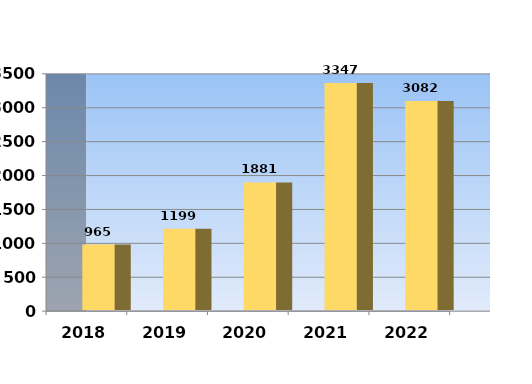
| Category | Series 0 |
|---|---|
| 2018.0 | 965 |
| 2019.0 | 1199 |
| 2020.0 | 1881 |
| 2021.0 | 3347 |
| 2022.0 | 3082 |